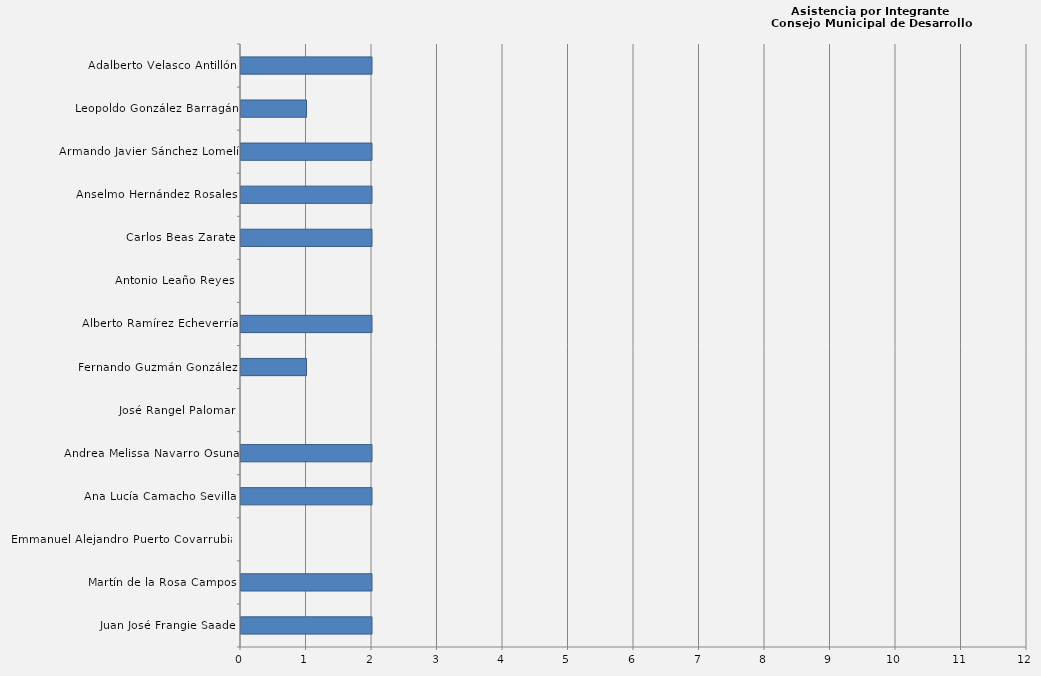
| Category | Series 0 |
|---|---|
| Juan José Frangie Saade | 2 |
| Martín de la Rosa Campos | 2 |
| Emmanuel Alejandro Puerto Covarrubias | 0 |
| Ana Lucía Camacho Sevilla | 2 |
| Andrea Melissa Navarro Osuna | 2 |
| José Rangel Palomar | 0 |
| Fernando Guzmán González | 1 |
| Alberto Ramírez Echeverría | 2 |
| Antonio Leaño Reyes | 0 |
| Carlos Beas Zarate | 2 |
| Anselmo Hernández Rosales | 2 |
| Armando Javier Sánchez Lomelí | 2 |
| Leopoldo González Barragán | 1 |
| Adalberto Velasco Antillón | 2 |